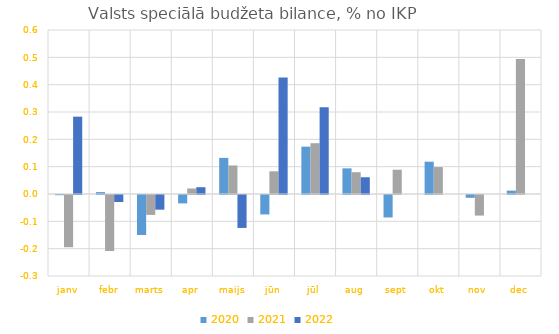
| Category | 2020 | 2021 | 2022 |
|---|---|---|---|
| janv | -0.001 | -0.191 | 0.283 |
| febr | 0.007 | -0.205 | -0.026 |
| marts | -0.146 | -0.073 | -0.054 |
| apr | -0.031 | 0.02 | 0.025 |
| maijs | 0.132 | 0.104 | -0.121 |
| jūn | -0.071 | 0.083 | 0.426 |
| jūl | 0.173 | 0.186 | 0.318 |
| aug | 0.094 | 0.08 | 0.061 |
| sept | -0.082 | 0.089 | 0 |
| okt | 0.118 | 0.099 | 0 |
| nov | -0.01 | -0.075 | 0 |
| dec | 0.012 | 0.494 | 0 |